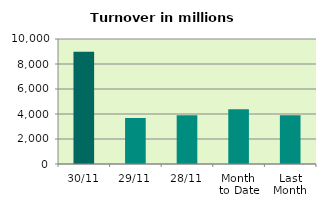
| Category | Series 0 |
|---|---|
| 30/11 | 8974.363 |
| 29/11 | 3670.071 |
| 28/11 | 3906.611 |
| Month 
to Date | 4388.555 |
| Last
Month | 3895.685 |